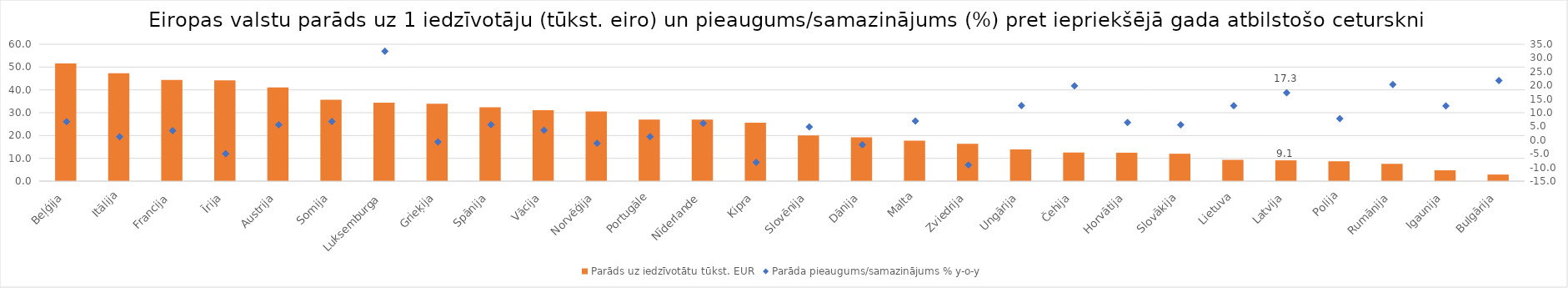
| Category | Parāds uz iedzīvotātu tūkst. EUR |
|---|---|
|  Beļģija | 51.609 |
| Itālija | 47.261 |
| Francija | 44.399 |
| Īrija | 44.197 |
|  Austrija | 41.037 |
| Somija | 35.659 |
| Luksemburga | 34.434 |
| Grieķija | 33.965 |
| Spānija | 32.367 |
| Vācija | 31.104 |
| Norvēģija | 30.535 |
| Portugāle | 26.98 |
| Nīderlande | 26.967 |
| Kipra | 25.574 |
| Slovēnija | 20.022 |
| Dānija | 19.213 |
| Malta | 17.765 |
| Zviedrija | 16.392 |
| Ungārija | 13.918 |
|  Čehija | 12.545 |
| Horvātija | 12.466 |
| Slovākija | 12.021 |
| Lietuva | 9.348 |
| Latvija | 9.117 |
| Polija | 8.711 |
| Rumānija | 7.585 |
| Igaunija | 4.755 |
|  Bulgārija | 2.89 |